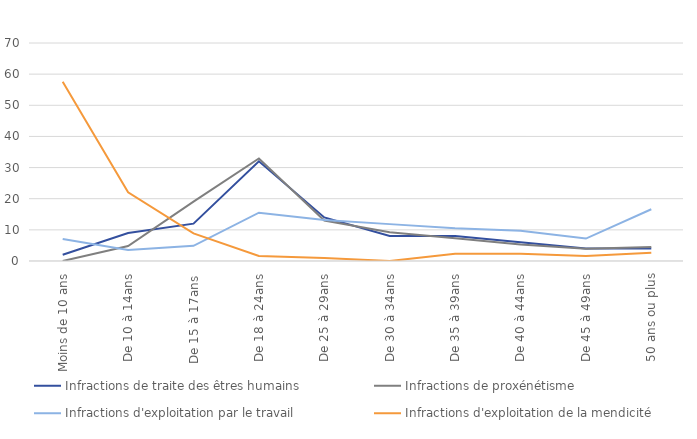
| Category | Infractions de traite des êtres humains | Infractions de proxénétisme | Infractions d'exploitation par le travail | Infractions d'exploitation de la mendicité |
|---|---|---|---|---|
| Moins de 10 ans | 2 | 0 | 7.04 | 57.57 |
| De 10 à 14ans | 9 | 4.8 | 3.52 | 22.04 |
| De 15 à 17ans  | 12 | 19.06 | 4.88 | 8.88 |
| De 18 à 24ans | 32 | 32.93 | 15.51 | 1.64 |
| De 25 à 29ans | 14 | 13 | 13.14 | 0.99 |
| De 30 à 34ans | 8 | 9.24 | 11.84 | 0 |
| De 35 à 39ans | 8 | 7.3 | 10.52 | 2.3 |
| De 40 à 44ans | 6 | 5.3 | 9.73 | 2.3 |
| De 45 à 49ans | 4 | 3.92 | 7.21 | 1.64 |
| 50 ans ou plus | 4 | 4.48 | 16.62 | 2.63 |